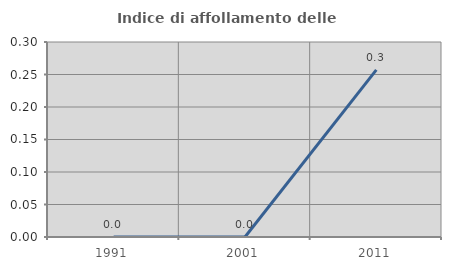
| Category | Indice di affollamento delle abitazioni  |
|---|---|
| 1991.0 | 0 |
| 2001.0 | 0 |
| 2011.0 | 0.257 |